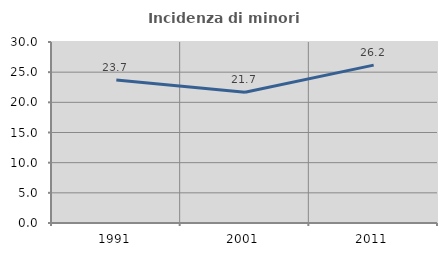
| Category | Incidenza di minori stranieri |
|---|---|
| 1991.0 | 23.684 |
| 2001.0 | 21.661 |
| 2011.0 | 26.172 |